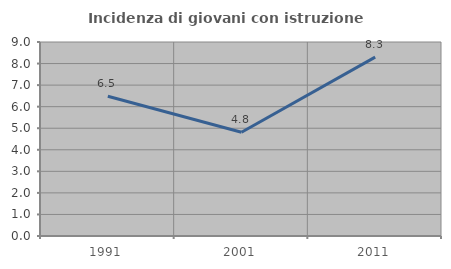
| Category | Incidenza di giovani con istruzione universitaria |
|---|---|
| 1991.0 | 6.486 |
| 2001.0 | 4.811 |
| 2011.0 | 8.296 |